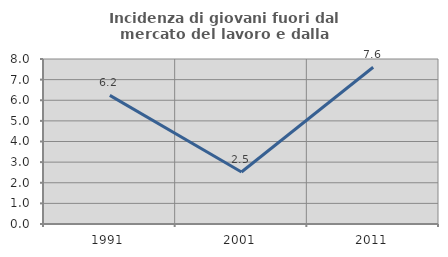
| Category | Incidenza di giovani fuori dal mercato del lavoro e dalla formazione  |
|---|---|
| 1991.0 | 6.236 |
| 2001.0 | 2.519 |
| 2011.0 | 7.599 |